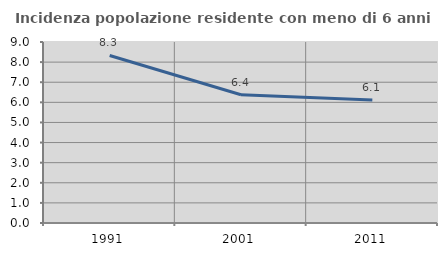
| Category | Incidenza popolazione residente con meno di 6 anni |
|---|---|
| 1991.0 | 8.33 |
| 2001.0 | 6.376 |
| 2011.0 | 6.116 |